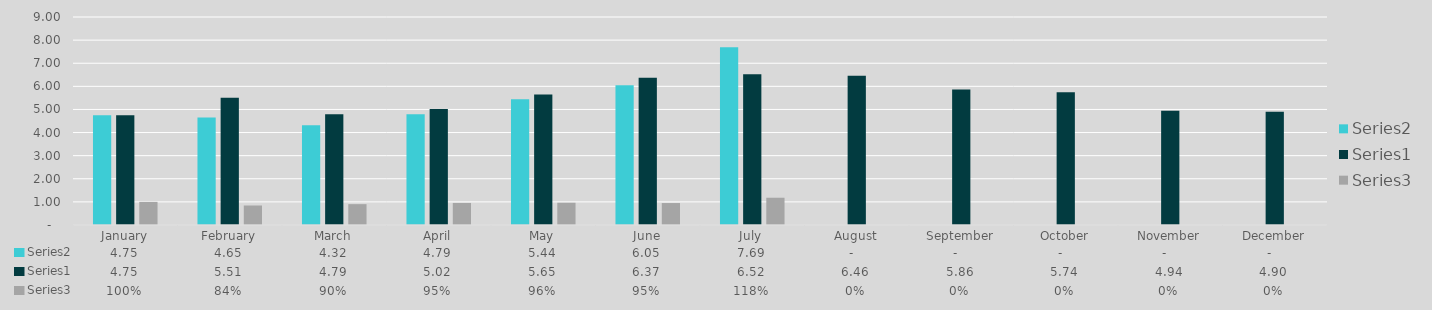
| Category | Series 1 | Series 0 | Series 2 |
|---|---|---|---|
| January | 4.75 | 4.75 | 1 |
| February | 4.65 | 5.51 | 0.844 |
| March | 4.32 | 4.79 | 0.902 |
| April | 4.79 | 5.02 | 0.954 |
| May | 5.44 | 5.65 | 0.963 |
| June | 6.05 | 6.37 | 0.95 |
| July | 7.69 | 6.52 | 1.179 |
| August | 0 | 6.46 | 0 |
| September | 0 | 5.86 | 0 |
| October | 0 | 5.74 | 0 |
| November | 0 | 4.94 | 0 |
| December | 0 | 4.9 | 0 |